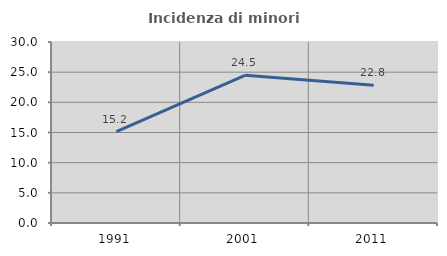
| Category | Incidenza di minori stranieri |
|---|---|
| 1991.0 | 15.152 |
| 2001.0 | 24.479 |
| 2011.0 | 22.826 |